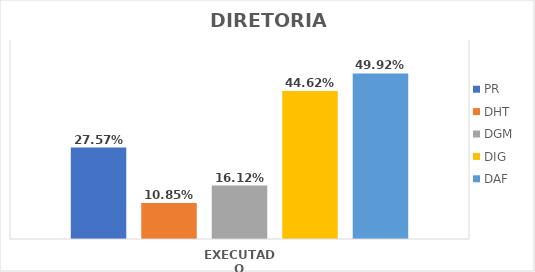
| Category | PR | DHT | DGM | DIG | DAF |
|---|---|---|---|---|---|
| EXECUTADO | 0.276 | 0.108 | 0.161 | 0.446 | 0.499 |